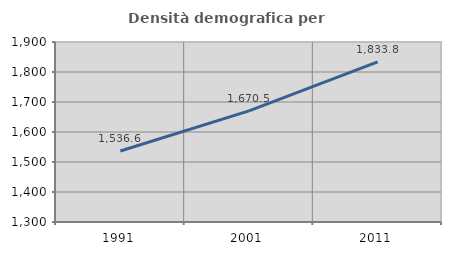
| Category | Densità demografica |
|---|---|
| 1991.0 | 1536.629 |
| 2001.0 | 1670.463 |
| 2011.0 | 1833.785 |